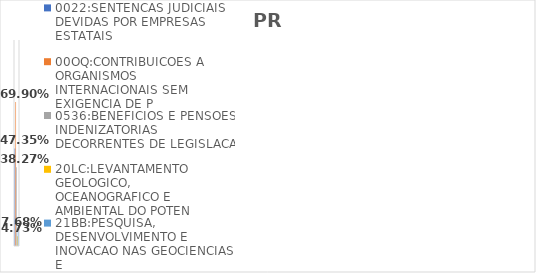
| Category | 0022:SENTENCAS JUDICIAIS DEVIDAS POR EMPRESAS ESTATAIS | 00OQ:CONTRIBUICOES A ORGANISMOS INTERNACIONAIS SEM EXIGENCIA DE P | 0536:BENEFICIOS E PENSOES INDENIZATORIAS DECORRENTES DE LEGISLACA | 20LC:LEVANTAMENTO GEOLOGICO, OCEANOGRAFICO E AMBIENTAL DO POTEN | 21BB:PESQUISA, DESENVOLVIMENTO E INOVACAO NAS GEOCIENCIAS E |
|---|---|---|---|---|---|
| EXECUTADO | 0.474 | 0.699 | 0.383 | 0.047 | 0.077 |